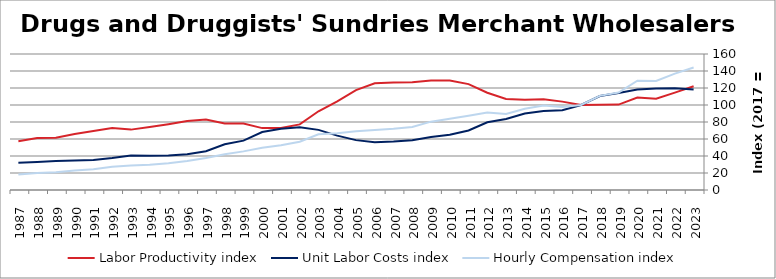
| Category | Labor Productivity index | Unit Labor Costs index | Hourly Compensation index |
|---|---|---|---|
| 2023.0 | 121.985 | 118.096 | 144.059 |
| 2022.0 | 114.525 | 119.591 | 136.961 |
| 2021.0 | 107.324 | 119.531 | 128.286 |
| 2020.0 | 108.797 | 118.241 | 128.643 |
| 2019.0 | 100.465 | 114.111 | 114.641 |
| 2018.0 | 100.15 | 110.6 | 110.766 |
| 2017.0 | 100 | 100 | 100 |
| 2016.0 | 103.979 | 93.903 | 97.64 |
| 2015.0 | 106.764 | 93.011 | 99.302 |
| 2014.0 | 106.134 | 90.035 | 95.557 |
| 2013.0 | 107.157 | 83.501 | 89.477 |
| 2012.0 | 114.431 | 79.698 | 91.199 |
| 2011.0 | 124.571 | 70.079 | 87.298 |
| 2010.0 | 128.87 | 64.949 | 83.701 |
| 2009.0 | 128.873 | 62.401 | 80.418 |
| 2008.0 | 126.845 | 58.526 | 74.237 |
| 2007.0 | 126.478 | 56.959 | 72.041 |
| 2006.0 | 125.553 | 56.319 | 70.71 |
| 2005.0 | 117.597 | 58.664 | 68.987 |
| 2004.0 | 104.322 | 63.957 | 66.721 |
| 2003.0 | 92.584 | 70.731 | 65.485 |
| 2002.0 | 77.142 | 73.674 | 56.834 |
| 2001.0 | 72.94 | 72.042 | 52.547 |
| 2000.0 | 72.798 | 68.172 | 49.628 |
| 1999.0 | 78.19 | 58.095 | 45.425 |
| 1998.0 | 78.254 | 53.772 | 42.079 |
| 1997.0 | 82.926 | 45.522 | 37.75 |
| 1996.0 | 81.185 | 42.05 | 34.139 |
| 1995.0 | 77.429 | 40.552 | 31.399 |
| 1994.0 | 74.022 | 40.245 | 29.79 |
| 1993.0 | 71.038 | 40.54 | 28.798 |
| 1992.0 | 72.913 | 37.558 | 27.385 |
| 1991.0 | 69.283 | 35.376 | 24.51 |
| 1990.0 | 65.949 | 34.625 | 22.834 |
| 1989.0 | 61.425 | 34.07 | 20.928 |
| 1988.0 | 61.038 | 32.949 | 20.111 |
| 1987.0 | 57.334 | 31.975 | 18.332 |